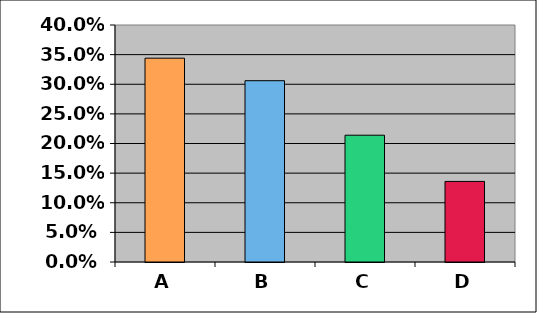
| Category | A | B | C | D |
|---|---|---|---|---|
| A | 0.344 | 0 | 0 | 0 |
| B | 0 | 0.306 | 0 | 0 |
| C | 0 | 0 | 0.214 | 0 |
| D | 0 | 0 | 0 | 0.136 |